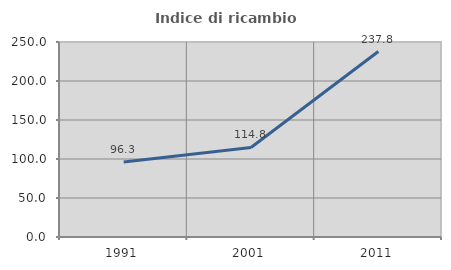
| Category | Indice di ricambio occupazionale  |
|---|---|
| 1991.0 | 96.281 |
| 2001.0 | 114.815 |
| 2011.0 | 237.815 |